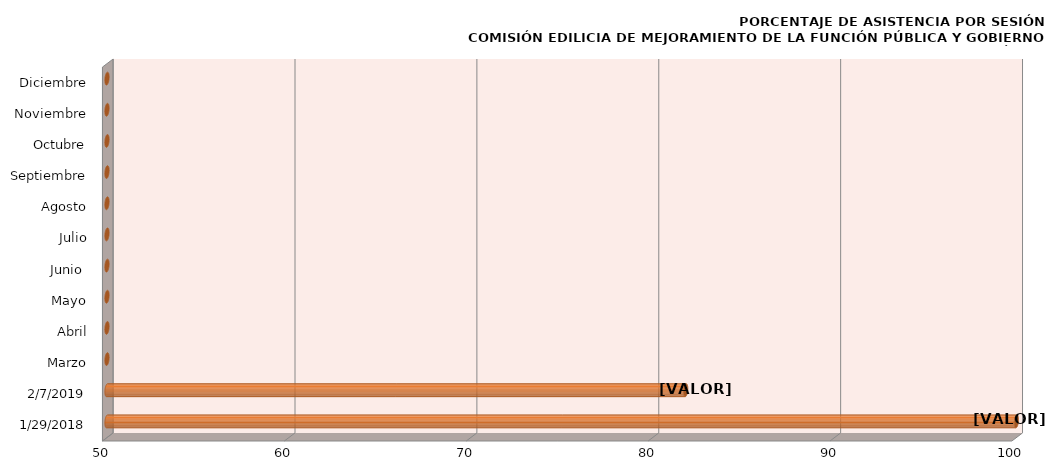
| Category | Series 0 |
|---|---|
| 29/01/2018 | 100 |
| 07/02/2019 | 81.818 |
| Marzo | 0 |
| Abril | 0 |
| Mayo | 0 |
| Junio  | 0 |
| Julio | 0 |
| Agosto | 0 |
| Septiembre | 0 |
| Octubre | 0 |
| Noviembre | 0 |
| Diciembre | 0 |